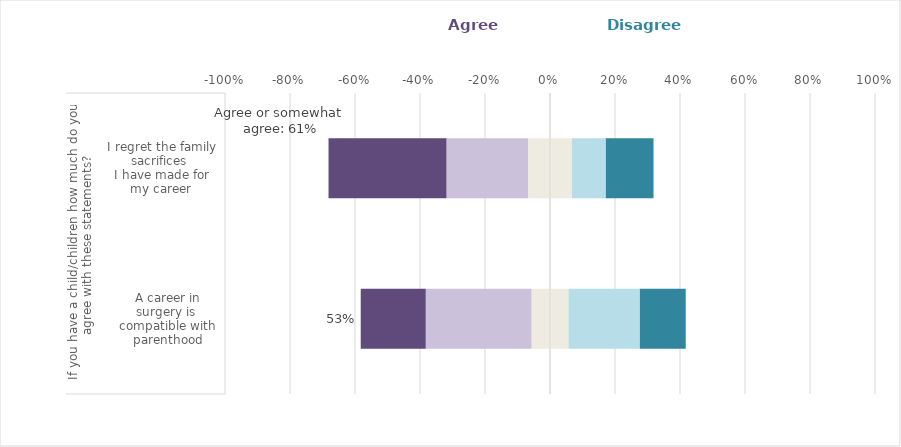
| Category | Neither agree nor disagree | Somewhat agree | Agree | Somewhat disagree | Disagree |
|---|---|---|---|---|---|
| 0 | 0.057 | -0.325 | -0.2 | 0.22 | 0.141 |
| 1 | 0.068 | -0.251 | -0.363 | 0.104 | 0.147 |